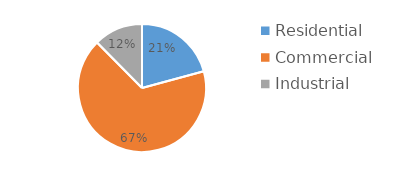
| Category |  163,747  |
|---|---|
| Residential | 163747 |
| Commercial | 525549 |
| Industrial | 97717 |